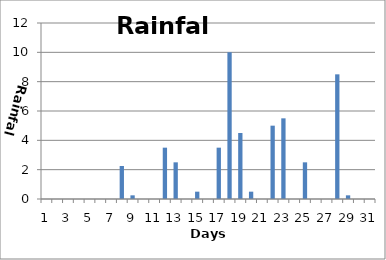
| Category | Series 0 |
|---|---|
| 0 | 0 |
| 1 | 0 |
| 2 | 0 |
| 3 | 0 |
| 4 | 0 |
| 5 | 0 |
| 6 | 0 |
| 7 | 2.25 |
| 8 | 0.25 |
| 9 | 0 |
| 10 | 0 |
| 11 | 3.5 |
| 12 | 2.5 |
| 13 | 0 |
| 14 | 0.5 |
| 15 | 0 |
| 16 | 3.5 |
| 17 | 10 |
| 18 | 4.5 |
| 19 | 0.5 |
| 20 | 0 |
| 21 | 5 |
| 22 | 5.5 |
| 23 | 0 |
| 24 | 2.5 |
| 25 | 0 |
| 26 | 0 |
| 27 | 8.5 |
| 28 | 0.25 |
| 29 | 0 |
| 30 | 0 |